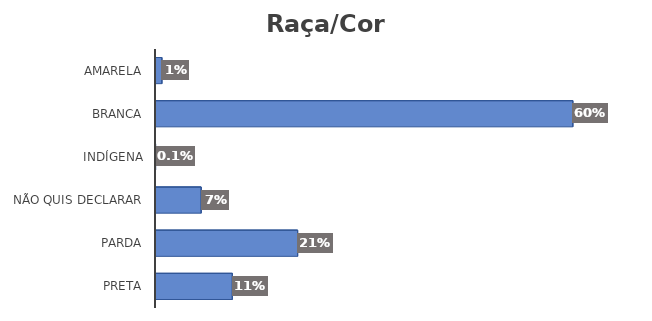
| Category | Series 0 |
|---|---|
| Preta | 0.112 |
| Parda | 0.206 |
| Não quis declarar | 0.067 |
| Indígena | 0.001 |
| Branca | 0.604 |
| Amarela | 0.01 |